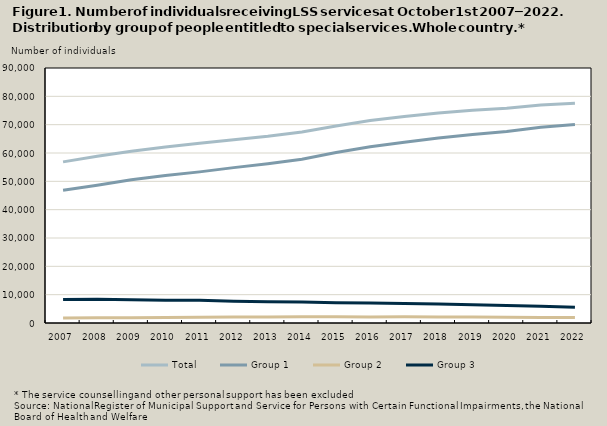
| Category | Total | Group 1 | Group 2 | Group 3 |
|---|---|---|---|---|
| 2007.0 | 56861 | 46888 | 1721 | 8252 |
| 2008.0 | 58825 | 48634 | 1809 | 8382 |
| 2009.0 | 60588 | 50529 | 1892 | 8167 |
| 2010.0 | 62096 | 52073 | 1975 | 8048 |
| 2011.0 | 63405 | 53341 | 2052 | 8012 |
| 2012.0 | 64655 | 54836 | 2104 | 7715 |
| 2013.0 | 65884 | 56225 | 2129 | 7530 |
| 2014.0 | 67397 | 57802 | 2168 | 7427 |
| 2015.0 | 69541 | 60185 | 2171 | 7185 |
| 2016.0 | 71432 | 62211 | 2133 | 7088 |
| 2017.0 | 72912 | 63828 | 2168 | 6916 |
| 2018.0 | 74087 | 65275 | 2095 | 6717 |
| 2019.0 | 75087 | 66546 | 2089 | 6452 |
| 2020.0 | 75801 | 67575 | 2024 | 6202 |
| 2021.0 | 76967 | 69124 | 1961 | 5882 |
| 2022.0 | 77546 | 70049 | 1899 | 5598 |